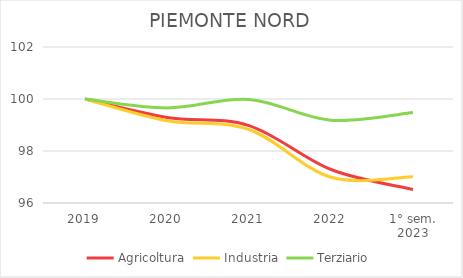
| Category | Agricoltura | Industria | Terziario |
|---|---|---|---|
| 2019 | 100 | 100 | 100 |
| 2020 | 99.29 | 99.166 | 99.659 |
| 2021 | 98.978 | 98.827 | 99.98 |
| 2022 | 97.288 | 96.99 | 99.187 |
| 1° sem.
2023 | 96.521 | 97.011 | 99.479 |